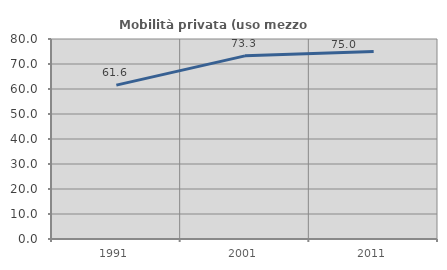
| Category | Mobilità privata (uso mezzo privato) |
|---|---|
| 1991.0 | 61.557 |
| 2001.0 | 73.261 |
| 2011.0 | 75.024 |